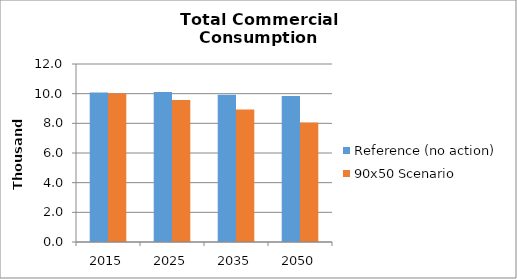
| Category | Reference (no action) | 90x50 Scenario |
|---|---|---|
| 2015.0 | 10.084 | 10.006 |
| 2025.0 | 10.115 | 9.575 |
| 2035.0 | 9.935 | 8.932 |
| 2050.0 | 9.841 | 8.055 |